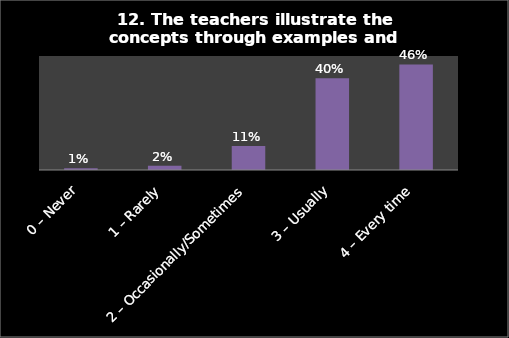
| Category | Series 0 |
|---|---|
| 0 – Never | 0.008 |
| 1 – Rarely | 0.018 |
| 2 – Occasionally/Sometimes | 0.106 |
| 3 – Usually | 0.403 |
| 4 – Every time | 0.463 |